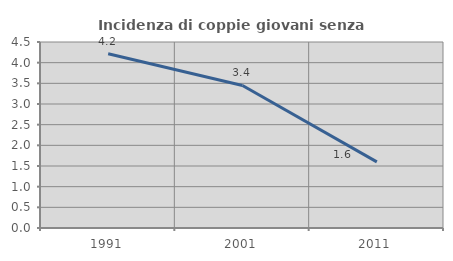
| Category | Incidenza di coppie giovani senza figli |
|---|---|
| 1991.0 | 4.217 |
| 2001.0 | 3.448 |
| 2011.0 | 1.6 |